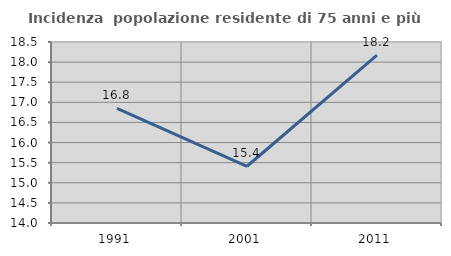
| Category | Incidenza  popolazione residente di 75 anni e più |
|---|---|
| 1991.0 | 16.85 |
| 2001.0 | 15.411 |
| 2011.0 | 18.172 |